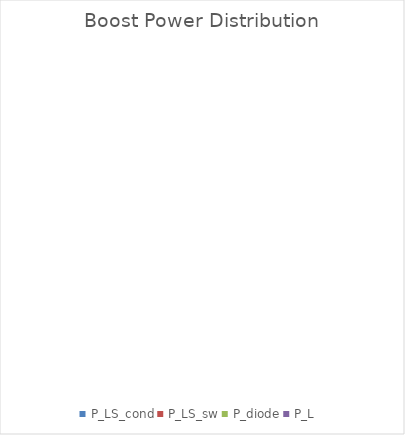
| Category | Boost Power Distribution |
|---|---|
| P_LS_cond | 0 |
| P_LS_sw | 0 |
| P_diode | 0 |
| P_L | 0 |